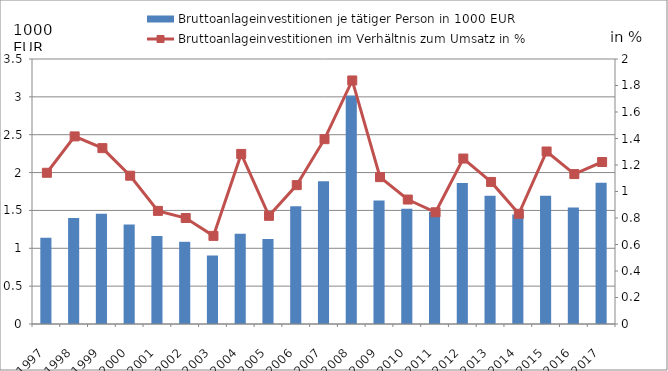
| Category | Bruttoanlageinvestitionen je tätiger Person in 1000 EUR |
|---|---|
| 1997.0 | 1.14 |
| 1998.0 | 1.4 |
| 1999.0 | 1.455 |
| 2000.0 | 1.315 |
| 2001.0 | 1.161 |
| 2002.0 | 1.086 |
| 2003.0 | 0.905 |
| 2004.0 | 1.192 |
| 2005.0 | 1.124 |
| 2006.0 | 1.554 |
| 2007.0 | 1.884 |
| 2008.0 | 3.017 |
| 2009.0 | 1.632 |
| 2010.0 | 1.521 |
| 2011.0 | 1.479 |
| 2012.0 | 1.863 |
| 2013.0 | 1.694 |
| 2014.0 | 1.448 |
| 2015.0 | 1.693 |
| 2016.0 | 1.54 |
| 2017.0 | 1.867 |